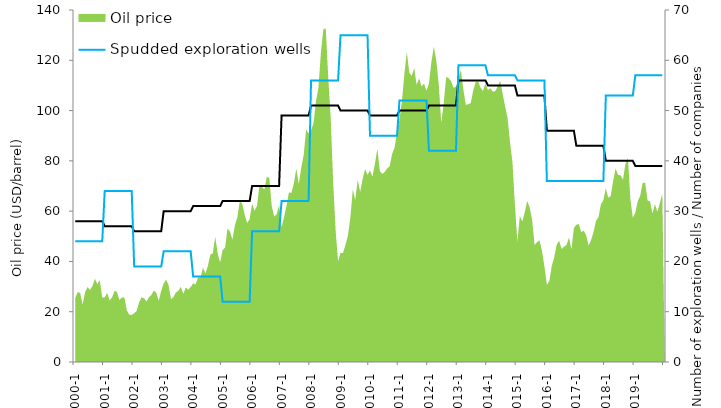
| Category | Number of companies on the shelf | Spudded exploration wells |
|---|---|---|
| 2000-1 | 28 | 24 |
| 2000-2 | 28 | 24 |
| 2000-3 | 28 | 24 |
| 2000-4 | 28 | 24 |
| 2000-5 | 28 | 24 |
| 2000-6 | 28 | 24 |
| 2000-7 | 28 | 24 |
| 2000-8 | 28 | 24 |
| 2000-9 | 28 | 24 |
| 2000-10 | 28 | 24 |
| 2000-11 | 28 | 24 |
| 2000-12 | 28 | 24 |
| 2001-1 | 27 | 34 |
| 2001-2 | 27 | 34 |
| 2001-3 | 27 | 34 |
| 2001-4 | 27 | 34 |
| 2001-5 | 27 | 34 |
| 2001-6 | 27 | 34 |
| 2001-7 | 27 | 34 |
| 2001-8 | 27 | 34 |
| 2001-9 | 27 | 34 |
| 2001-10 | 27 | 34 |
| 2001-11 | 27 | 34 |
| 2001-12 | 27 | 34 |
| 2002-1 | 26 | 19 |
| 2002-2 | 26 | 19 |
| 2002-3 | 26 | 19 |
| 2002-4 | 26 | 19 |
| 2002-5 | 26 | 19 |
| 2002-6 | 26 | 19 |
| 2002-7 | 26 | 19 |
| 2002-8 | 26 | 19 |
| 2002-9 | 26 | 19 |
| 2002-10 | 26 | 19 |
| 2002-11 | 26 | 19 |
| 2002-12 | 26 | 19 |
| 2003-1 | 30 | 22 |
| 2003-2 | 30 | 22 |
| 2003-3 | 30 | 22 |
| 2003-4 | 30 | 22 |
| 2003-5 | 30 | 22 |
| 2003-6 | 30 | 22 |
| 2003-7 | 30 | 22 |
| 2003-8 | 30 | 22 |
| 2003-9 | 30 | 22 |
| 2003-10 | 30 | 22 |
| 2003-11 | 30 | 22 |
| 2003-12 | 30 | 22 |
| 2004-1 | 31 | 17 |
| 2004-2 | 31 | 17 |
| 2004-3 | 31 | 17 |
| 2004-4 | 31 | 17 |
| 2004-5 | 31 | 17 |
| 2004-6 | 31 | 17 |
| 2004-7 | 31 | 17 |
| 2004-8 | 31 | 17 |
| 2004-9 | 31 | 17 |
| 2004-10 | 31 | 17 |
| 2004-11 | 31 | 17 |
| 2004-12 | 31 | 17 |
| 2005-1 | 32 | 12 |
| 2005-2 | 32 | 12 |
| 2005-3 | 32 | 12 |
| 2005-4 | 32 | 12 |
| 2005-5 | 32 | 12 |
| 2005-6 | 32 | 12 |
| 2005-7 | 32 | 12 |
| 2005-8 | 32 | 12 |
| 2005-9 | 32 | 12 |
| 2005-10 | 32 | 12 |
| 2005-11 | 32 | 12 |
| 2005-12 | 32 | 12 |
| 2006-1 | 35 | 26 |
| 2006-2 | 35 | 26 |
| 2006-3 | 35 | 26 |
| 2006-4 | 35 | 26 |
| 2006-5 | 35 | 26 |
| 2006-6 | 35 | 26 |
| 2006-7 | 35 | 26 |
| 2006-8 | 35 | 26 |
| 2006-9 | 35 | 26 |
| 2006-10 | 35 | 26 |
| 2006-11 | 35 | 26 |
| 2006-12 | 35 | 26 |
| 2007-1 | 49 | 32 |
| 2007-2 | 49 | 32 |
| 2007-3 | 49 | 32 |
| 2007-4 | 49 | 32 |
| 2007-5 | 49 | 32 |
| 2007-6 | 49 | 32 |
| 2007-7 | 49 | 32 |
| 2007-8 | 49 | 32 |
| 2007-9 | 49 | 32 |
| 2007-10 | 49 | 32 |
| 2007-11 | 49 | 32 |
| 2007-12 | 49 | 32 |
| 2008-1 | 51 | 56 |
| 2008-2 | 51 | 56 |
| 2008-3 | 51 | 56 |
| 2008-4 | 51 | 56 |
| 2008-5 | 51 | 56 |
| 2008-6 | 51 | 56 |
| 2008-7 | 51 | 56 |
| 2008-8 | 51 | 56 |
| 2008-9 | 51 | 56 |
| 2008-10 | 51 | 56 |
| 2008-11 | 51 | 56 |
| 2008-12 | 51 | 56 |
| 2009-1 | 50 | 65 |
| 2009-2 | 50 | 65 |
| 2009-3 | 50 | 65 |
| 2009-4 | 50 | 65 |
| 2009-5 | 50 | 65 |
| 2009-6 | 50 | 65 |
| 2009-7 | 50 | 65 |
| 2009-8 | 50 | 65 |
| 2009-9 | 50 | 65 |
| 2009-10 | 50 | 65 |
| 2009-11 | 50 | 65 |
| 2009-12 | 50 | 65 |
| 2010-1 | 49 | 45 |
| 2010-2 | 49 | 45 |
| 2010-3 | 49 | 45 |
| 2010-4 | 49 | 45 |
| 2010-5 | 49 | 45 |
| 2010-6 | 49 | 45 |
| 2010-7 | 49 | 45 |
| 2010-8 | 49 | 45 |
| 2010-9 | 49 | 45 |
| 2010-10 | 49 | 45 |
| 2010-11 | 49 | 45 |
| 2010-12 | 49 | 45 |
| 2011-1 | 50 | 52 |
| 2011-2 | 50 | 52 |
| 2011-3 | 50 | 52 |
| 2011-4 | 50 | 52 |
| 2011-5 | 50 | 52 |
| 2011-6 | 50 | 52 |
| 2011-7 | 50 | 52 |
| 2011-8 | 50 | 52 |
| 2011-9 | 50 | 52 |
| 2011-10 | 50 | 52 |
| 2011-11 | 50 | 52 |
| 2011-12 | 50 | 52 |
| 2012-1 | 51 | 42 |
| 2012-2 | 51 | 42 |
| 2012-3 | 51 | 42 |
| 2012-4 | 51 | 42 |
| 2012-5 | 51 | 42 |
| 2012-6 | 51 | 42 |
| 2012-7 | 51 | 42 |
| 2012-8 | 51 | 42 |
| 2012-9 | 51 | 42 |
| 2012-10 | 51 | 42 |
| 2012-11 | 51 | 42 |
| 2012-12 | 51 | 42 |
| 2013-1 | 56 | 59 |
| 2013-2 | 56 | 59 |
| 2013-3 | 56 | 59 |
| 2013-4 | 56 | 59 |
| 2013-5 | 56 | 59 |
| 2013-6 | 56 | 59 |
| 2013-7 | 56 | 59 |
| 2013-8 | 56 | 59 |
| 2013-9 | 56 | 59 |
| 2013-10 | 56 | 59 |
| 2013-11 | 56 | 59 |
| 2013-12 | 56 | 59 |
| 2014-1 | 55 | 57 |
| 2014-2 | 55 | 57 |
| 2014-3 | 55 | 57 |
| 2014-4 | 55 | 57 |
| 2014-5 | 55 | 57 |
| 2014-6 | 55 | 57 |
| 2014-7 | 55 | 57 |
| 2014-8 | 55 | 57 |
| 2014-9 | 55 | 57 |
| 2014-10 | 55 | 57 |
| 2014-11 | 55 | 57 |
| 2014-12 | 55 | 57 |
| 2015-1 | 53 | 56 |
| 2015-2 | 53 | 56 |
| 2015-3 | 53 | 56 |
| 2015-4 | 53 | 56 |
| 2015-5 | 53 | 56 |
| 2015-6 | 53 | 56 |
| 2015-7 | 53 | 56 |
| 2015-8 | 53 | 56 |
| 2015-9 | 53 | 56 |
| 2015-10 | 53 | 56 |
| 2015-11 | 53 | 56 |
| 2015-12 | 53 | 56 |
| 2016-1 | 46 | 36 |
| 2016-2 | 46 | 36 |
| 2016-3 | 46 | 36 |
| 2016-4 | 46 | 36 |
| 2016-5 | 46 | 36 |
| 2016-6 | 46 | 36 |
| 2016-7 | 46 | 36 |
| 2016-8 | 46 | 36 |
| 2016-9 | 46 | 36 |
| 2016-10 | 46 | 36 |
| 2016-11 | 46 | 36 |
| 2016-12 | 46 | 36 |
| 2017-1 | 43 | 36 |
| 2017-2 | 43 | 36 |
| 2017-3 | 43 | 36 |
| 2017-4 | 43 | 36 |
| 2017-5 | 43 | 36 |
| 2017-6 | 43 | 36 |
| 2017-7 | 43 | 36 |
| 2017-8 | 43 | 36 |
| 2017-9 | 43 | 36 |
| 2017-10 | 43 | 36 |
| 2017-11 | 43 | 36 |
| 2017-12 | 43 | 36 |
| 2018-1 | 40 | 53 |
| 2018-2 | 40 | 53 |
| 2018-3 | 40 | 53 |
| 2018-4 | 40 | 53 |
| 2018-5 | 40 | 53 |
| 2018-6 | 40 | 53 |
| 2018-7 | 40 | 53 |
| 2018-8 | 40 | 53 |
| 2018-9 | 40 | 53 |
| 2018-10 | 40 | 53 |
| 2018-11 | 40 | 53 |
| 2018-12 | 40 | 53 |
| 2019-1 | 39 | 57 |
| 2019-2 | 39 | 57 |
| 2019-3 | 39 | 57 |
| 2019-4 | 39 | 57 |
| 2019-5 | 39 | 57 |
| 2019-6 | 39 | 57 |
| 2019-7 | 39 | 57 |
| 2019-8 | 39 | 57 |
| 2019-9 | 39 | 57 |
| 2019-10 | 39 | 57 |
| 2019-11 | 39 | 57 |
| 2019-12 | 39 | 57 |